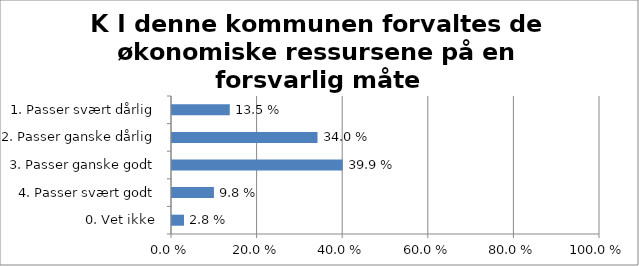
| Category | K I denne kommunen forvaltes de økonomiske ressursene på en forsvarlig måte |
|---|---|
| 1. Passer svært dårlig | 0.135 |
| 2. Passer ganske dårlig | 0.34 |
| 3. Passer ganske godt | 0.399 |
| 4. Passer svært godt | 0.098 |
| 0. Vet ikke | 0.028 |